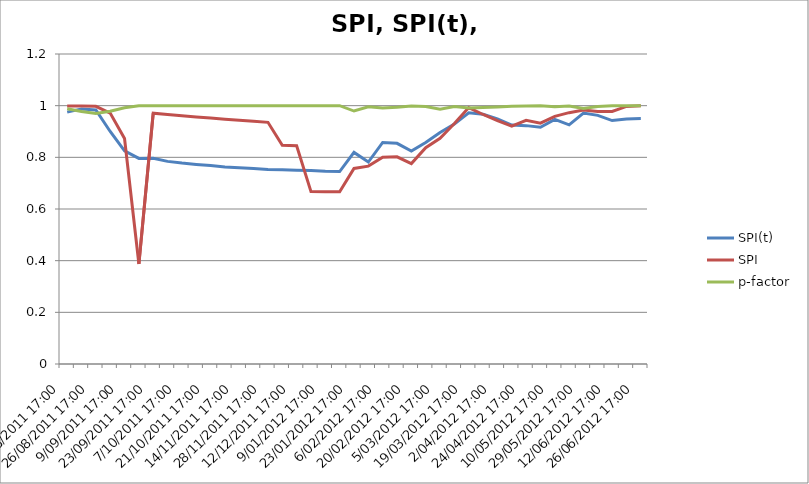
| Category | SPI(t) | SPI | p-factor |
|---|---|---|---|
| 11/08/2011 17:00 | 0.975 | 0.999 | 0.988 |
| 19/08/2011 17:00 | 0.988 | 0.998 | 0.977 |
| 26/08/2011 17:00 | 0.983 | 0.998 | 0.969 |
| 2/09/2011 17:00 | 0.9 | 0.971 | 0.978 |
| 9/09/2011 17:00 | 0.825 | 0.873 | 0.992 |
| 16/09/2011 17:00 | 0.796 | 0.387 | 1 |
| 23/09/2011 17:00 | 0.796 | 0.971 | 1 |
| 30/09/2011 17:00 | 0.784 | 0.966 | 1 |
| 7/10/2011 17:00 | 0.778 | 0.961 | 1 |
| 14/10/2011 17:00 | 0.772 | 0.956 | 1 |
| 21/10/2011 17:00 | 0.768 | 0.952 | 1 |
| 28/10/2011 17:00 | 0.762 | 0.948 | 1 |
| 14/11/2011 17:00 | 0.76 | 0.943 | 1 |
| 21/11/2011 17:00 | 0.757 | 0.939 | 1 |
| 28/11/2011 17:00 | 0.753 | 0.936 | 1 |
| 5/12/2011 17:00 | 0.752 | 0.847 | 1 |
| 12/12/2011 17:00 | 0.75 | 0.845 | 1 |
| 19/12/2011 17:00 | 0.749 | 0.667 | 1 |
| 9/01/2012 17:00 | 0.746 | 0.667 | 1 |
| 16/01/2012 17:00 | 0.745 | 0.666 | 1 |
| 23/01/2012 17:00 | 0.819 | 0.757 | 0.979 |
| 30/01/2012 17:00 | 0.782 | 0.766 | 0.996 |
| 6/02/2012 17:00 | 0.858 | 0.801 | 0.991 |
| 13/02/2012 17:00 | 0.854 | 0.802 | 0.994 |
| 20/02/2012 17:00 | 0.824 | 0.776 | 0.999 |
| 27/02/2012 17:00 | 0.858 | 0.837 | 0.997 |
| 5/03/2012 17:00 | 0.896 | 0.874 | 0.986 |
| 12/03/2012 17:00 | 0.929 | 0.931 | 0.997 |
| 19/03/2012 17:00 | 0.972 | 0.993 | 0.991 |
| 26/03/2012 17:00 | 0.967 | 0.966 | 0.993 |
| 2/04/2012 17:00 | 0.948 | 0.942 | 0.995 |
| 17/04/2012 17:00 | 0.925 | 0.921 | 0.998 |
| 24/04/2012 17:00 | 0.923 | 0.943 | 0.999 |
| 3/05/2012 17:00 | 0.916 | 0.932 | 1 |
| 10/05/2012 17:00 | 0.947 | 0.959 | 0.996 |
| 21/05/2012 17:00 | 0.926 | 0.973 | 0.999 |
| 29/05/2012 17:00 | 0.972 | 0.983 | 0.989 |
| 5/06/2012 17:00 | 0.962 | 0.978 | 0.997 |
| 12/06/2012 17:00 | 0.942 | 0.978 | 0.999 |
| 19/06/2012 17:00 | 0.949 | 0.997 | 1 |
| 26/06/2012 17:00 | 0.95 | 1 | 1 |